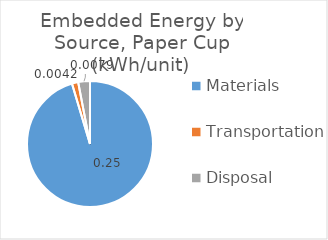
| Category | Series 0 |
|---|---|
| Materials | 0.25 |
| Transportation | 0.004 |
| Disposal | 0.008 |